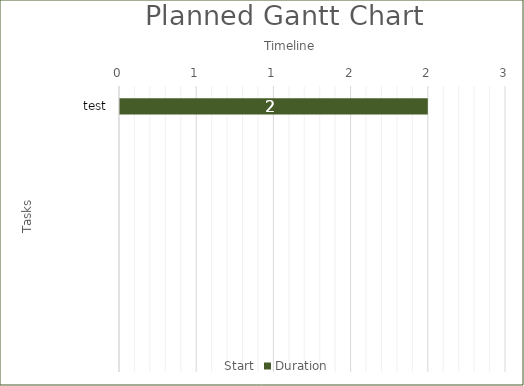
| Category | Start | Duration |
|---|---|---|
| test | 0 | 2 |